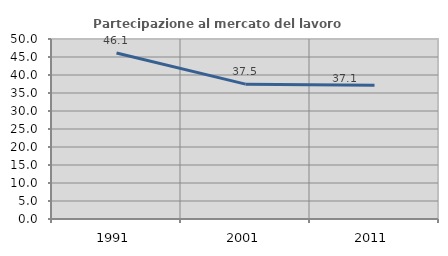
| Category | Partecipazione al mercato del lavoro  femminile |
|---|---|
| 1991.0 | 46.13 |
| 2001.0 | 37.461 |
| 2011.0 | 37.125 |